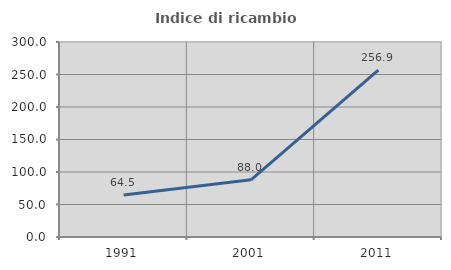
| Category | Indice di ricambio occupazionale  |
|---|---|
| 1991.0 | 64.486 |
| 2001.0 | 88.034 |
| 2011.0 | 256.897 |